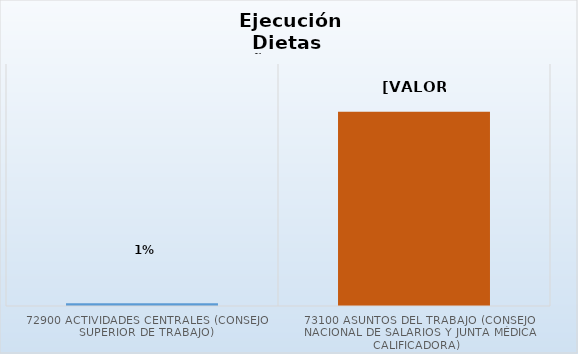
| Category | Series 0 |
|---|---|
| 72900 Actividades Centrales (Consejo Superior de Trabajo) | 0.014 |
| 73100 Asuntos del Trabajo (Consejo Nacional de Salarios y Junta Médica Calificadora) | 0.964 |